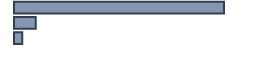
| Category | Percentatge |
|---|---|
| 0 | 87.5 |
| 1 | 9.091 |
| 2 | 3.409 |
| 3 | 0 |